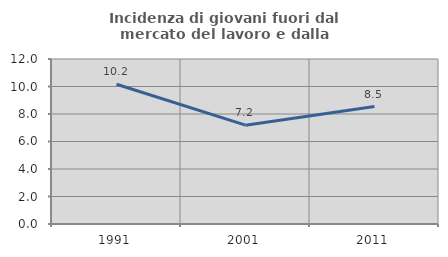
| Category | Incidenza di giovani fuori dal mercato del lavoro e dalla formazione  |
|---|---|
| 1991.0 | 10.164 |
| 2001.0 | 7.189 |
| 2011.0 | 8.54 |